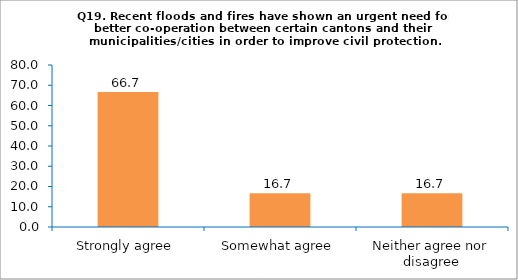
| Category | Series 0 |
|---|---|
| Strongly agree | 66.667 |
| Somewhat agree | 16.667 |
| Neither agree nor disagree | 16.667 |